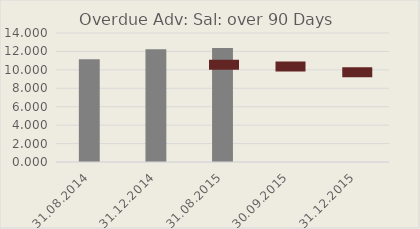
| Category | Overdue Adv: Sal: over 90 Days |
|---|---|
| 31.08.2014 | 11.138 |
| 31.12.2014 | 12.246 |
| 31.08.2015 | 12.362 |
| 30.09.2015 | 0 |
| 31.12.2015 | 0 |